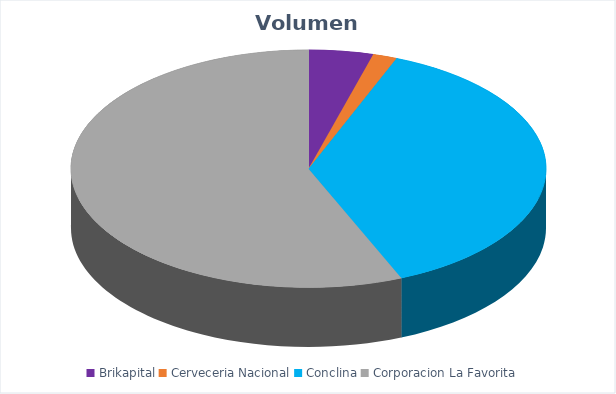
| Category | VOLUMEN ($USD) |
|---|---|
| Brikapital | 12000 |
| Cerveceria Nacional | 4505 |
| Conclina | 102824 |
| Corporacion La Favorita | 154271.26 |